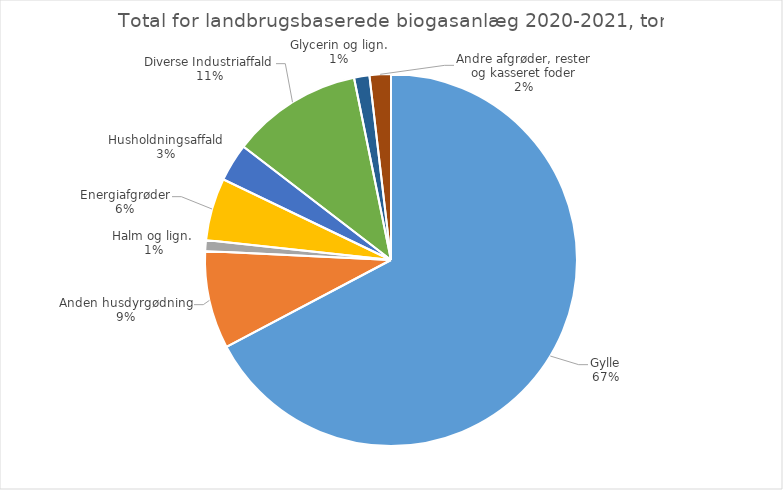
| Category | Series 0 |
|---|---|
| Gylle | 9564588.72 |
| Anden husdyrgødning | 1208754.6 |
| Halm og lign.  | 133053.01 |
| Energiafgrøder | 771309.55 |
| Husholdningsaffald | 468822.79 |
| Diverse Industriaffald | 1618799.05 |
| Glycerin og lign. | 189941.22 |
| Andre afgrøder, rester og kasseret foder | 263405.87 |